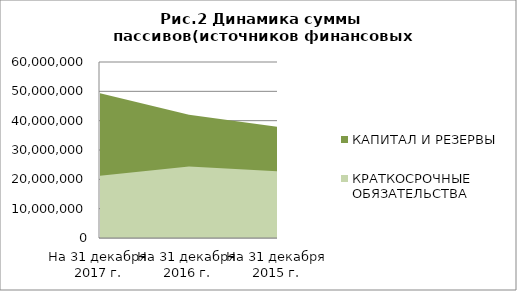
| Category | КАПИТАЛ И РЕЗЕРВЫ | ДОЛГОСРОЧНЫЕ ОБЯЗАТЕЛЬСТВА | КРАТКОСРОЧНЫЕ ОБЯЗАТЕЛЬСТВА |
|---|---|---|---|
| На 31 декабря 2017 г. | 49312701 | 376376 | 21222843 |
| На 31 декабря 2016 г. | 42043116 | 649071 | 24387428 |
| На 31 декабря 2015 г. | 37895029 | 792137 | 22703065 |